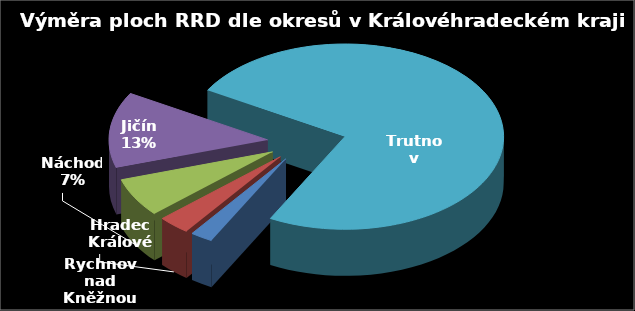
| Category | Výměra [ha] |
|---|---|
| Rychnov nad Kněžnou | 4.66 |
| Hradec Králové | 6.66 |
| Náchod | 13.68 |
| Jičín | 26.81 |
| Trutnov | 150.73 |